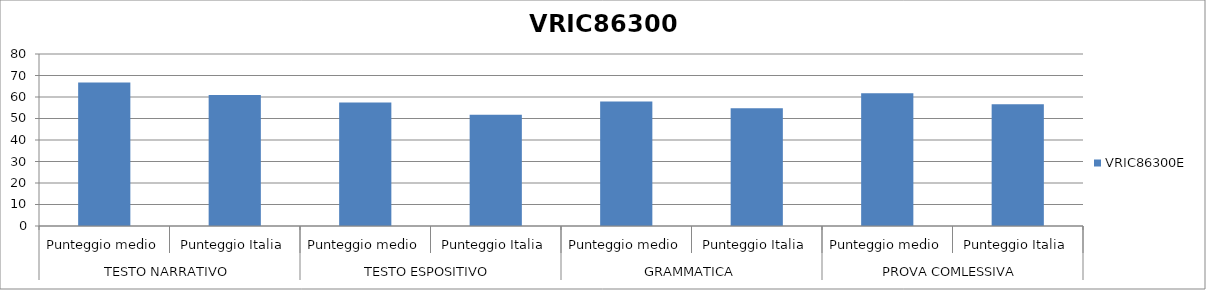
| Category | VRIC86300E |
|---|---|
| 0 | 66.8 |
| 1 | 60.9 |
| 2 | 57.5 |
| 3 | 51.7 |
| 4 | 57.9 |
| 5 | 54.8 |
| 6 | 61.8 |
| 7 | 56.6 |